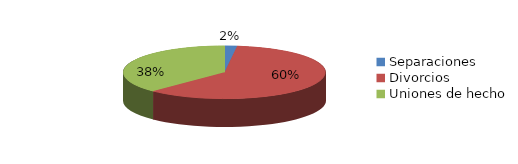
| Category | Series 0 |
|---|---|
| Separaciones | 20 |
| Divorcios | 613 |
| Uniones de hecho | 382 |